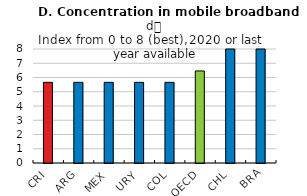
| Category | Series 0 |
|---|---|
| CRI | 5.66 |
| ARG | 5.66 |
| MEX | 5.66 |
| URY | 5.66 |
| COL | 5.66 |
| OECD | 6.46 |
| CHL | 8 |
| BRA | 8 |